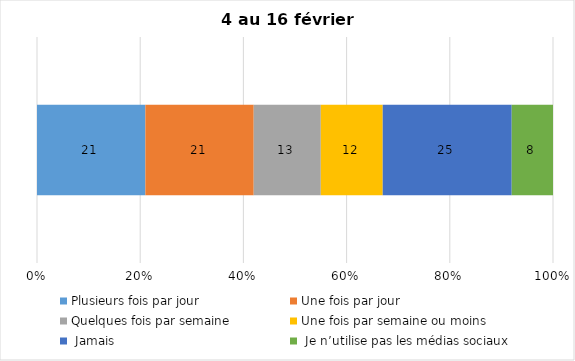
| Category | Plusieurs fois par jour | Une fois par jour | Quelques fois par semaine   | Une fois par semaine ou moins   |  Jamais   |  Je n’utilise pas les médias sociaux |
|---|---|---|---|---|---|---|
| 0 | 21 | 21 | 13 | 12 | 25 | 8 |